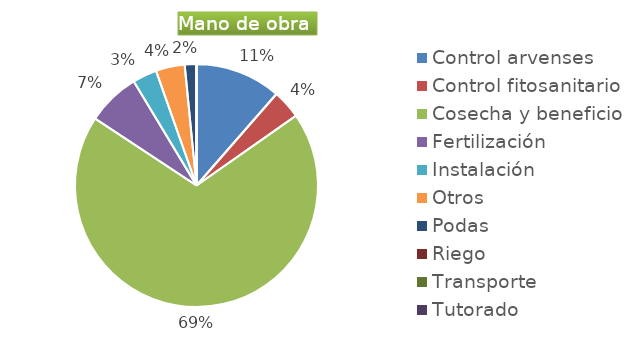
| Category | Series 0 |
|---|---|
| Control arvenses | 11094916 |
| Control fitosanitario | 3726336 |
| Cosecha y beneficio | 67018331 |
| Fertilización | 6870432 |
| Instalación | 3144096 |
| Otros | 3726336 |
| Podas | 1513824 |
| Riego | 0 |
| Transporte | 0 |
| Tutorado | 0 |